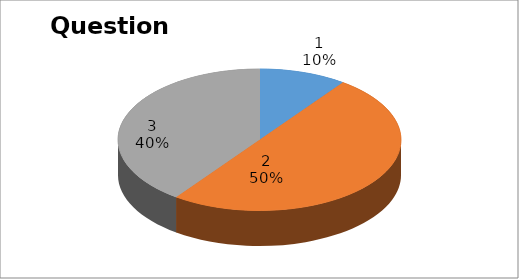
| Category | Series 0 |
|---|---|
| 0 | 1 |
| 1 | 5 |
| 2 | 4 |